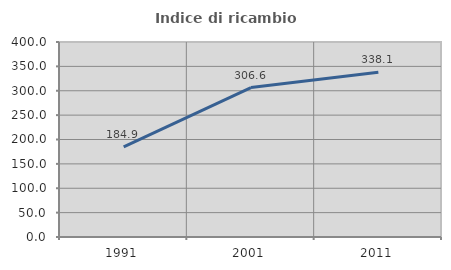
| Category | Indice di ricambio occupazionale  |
|---|---|
| 1991.0 | 184.871 |
| 2001.0 | 306.63 |
| 2011.0 | 338.073 |